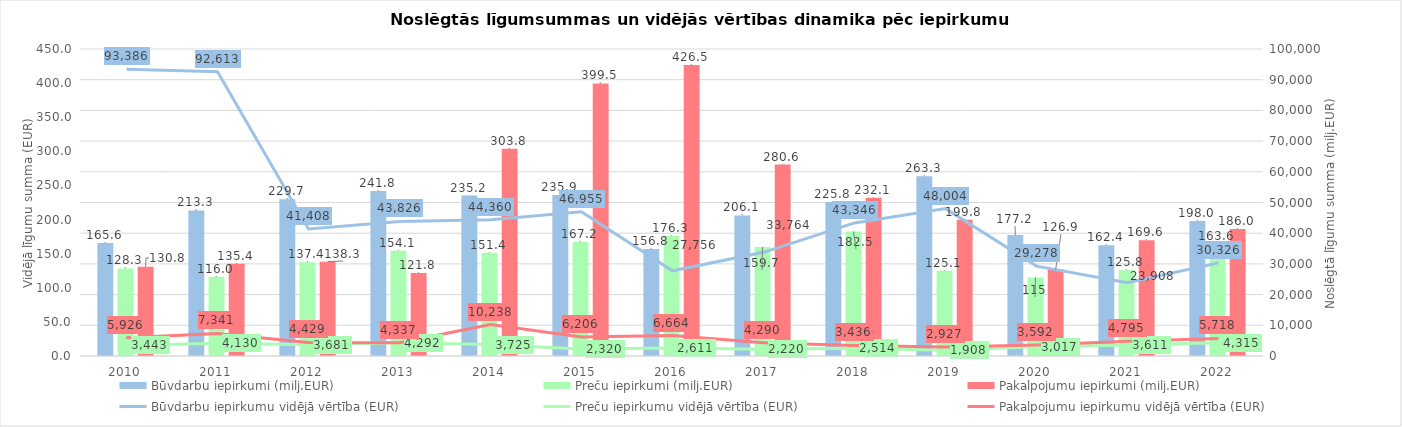
| Category | Būvdarbu iepirkumi (milj.EUR) | Preču iepirkumi (milj.EUR) | Pakalpojumu iepirkumi (milj.EUR) |
|---|---|---|---|
| 2010.0 | 165.6 | 128.3 | 130.8 |
| 2011.0 | 213.3 | 116 | 135.4 |
| 2012.0 | 229.7 | 137.4 | 138.3 |
| 2013.0 | 241.8 | 154.1 | 121.8 |
| 2014.0 | 235.2 | 151.4 | 303.8 |
| 2015.0 | 235.9 | 167.2 | 399.5 |
| 2016.0 | 156.8 | 176.3 | 426.5 |
| 2017.0 | 206.1 | 159.7 | 280.6 |
| 2018.0 | 225.8 | 182.5 | 232.1 |
| 2019.0 | 263.3 | 125.1 | 199.8 |
| 2020.0 | 177.2 | 115 | 126.9 |
| 2021.0 | 162.4 | 125.8 | 169.6 |
| 2022.0 | 198 | 163.6 | 186 |